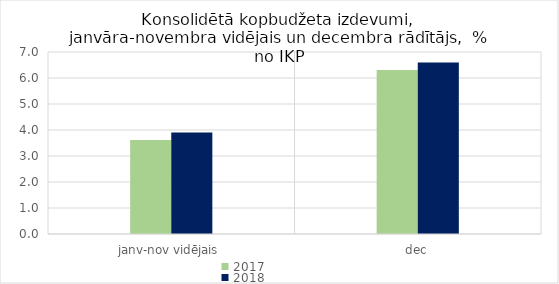
| Category | 2017 | 2018 |
|---|---|---|
| janv-nov vidējais | 3.619 | 3.909 |
| dec | 6.312 | 6.596 |